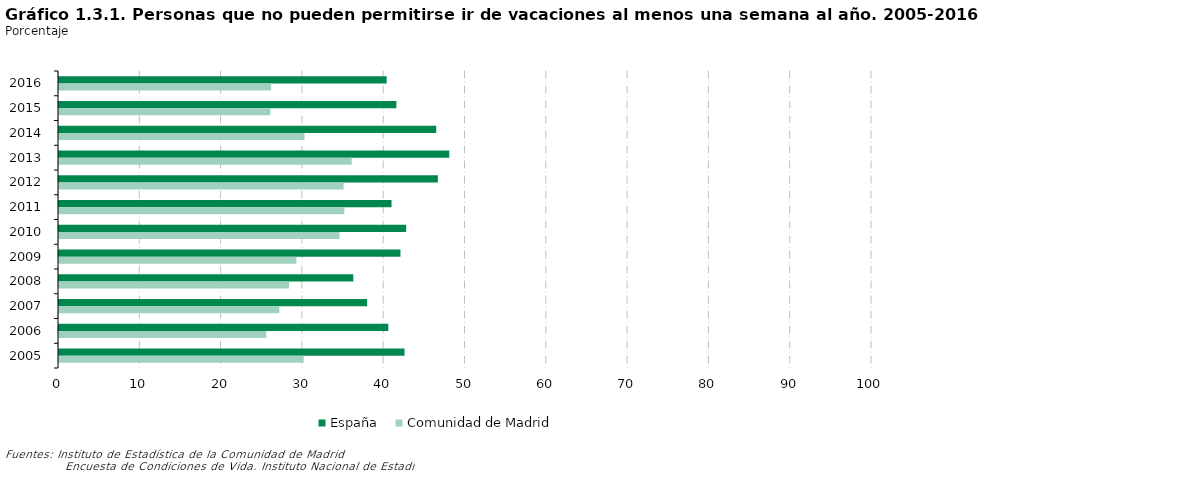
| Category | España | Comunidad de Madrid |
|---|---|---|
| 2016 | 40.3 | 26.1 |
| 2015 | 41.5 | 26 |
| 2014 | 46.4 | 30.2 |
| 2013 | 48 | 36 |
| 2012 | 46.6 | 35 |
| 2011 | 40.9 | 35.1 |
| 2010 | 42.7 | 34.5 |
| 2009 | 42 | 29.2 |
| 2008 | 36.2 | 28.3 |
| 2007 | 37.9 | 27.1 |
| 2006 | 40.5 | 25.5 |
| 2005 | 42.5 | 30.1 |